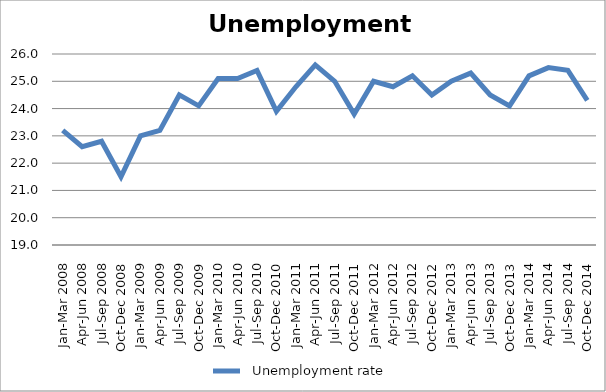
| Category |   Unemployment rate |
|---|---|
| Jan-Mar 2008 | 23.2 |
| Apr-Jun 2008 | 22.6 |
| Jul-Sep 2008 | 22.8 |
| Oct-Dec 2008 | 21.5 |
| Jan-Mar 2009 | 23 |
| Apr-Jun 2009 | 23.2 |
| Jul-Sep 2009 | 24.5 |
| Oct-Dec 2009 | 24.1 |
| Jan-Mar 2010 | 25.1 |
| Apr-Jun 2010 | 25.1 |
| Jul-Sep 2010 | 25.4 |
| Oct-Dec 2010 | 23.9 |
| Jan-Mar 2011 | 24.8 |
| Apr-Jun 2011 | 25.6 |
| Jul-Sep 2011 | 25 |
| Oct-Dec 2011 | 23.8 |
| Jan-Mar 2012 | 25 |
| Apr-Jun 2012 | 24.8 |
| Jul-Sep 2012 | 25.2 |
| Oct-Dec 2012 | 24.5 |
| Jan-Mar 2013 | 25 |
| Apr-Jun 2013 | 25.3 |
| Jul-Sep 2013 | 24.5 |
| Oct-Dec 2013 | 24.1 |
| Jan-Mar 2014 | 25.2 |
| Apr-Jun 2014 | 25.5 |
| Jul-Sep 2014 | 25.4 |
| Oct-Dec 2014 | 24.3 |